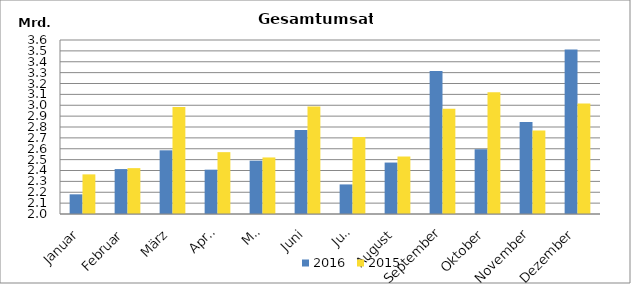
| Category | 2016 | 2015 |
|---|---|---|
| Januar | 2181005.496 | 2364422.329 |
| Februar | 2413069.528 | 2421814.356 |
| März | 2585646.815 | 2983089.045 |
| April | 2407559.039 | 2568682.095 |
| Mai | 2490384.55 | 2520047.22 |
| Juni | 2773486.725 | 2988183.922 |
| Juli | 2271984.23 | 2708478.189 |
| August | 2473032.683 | 2528625.966 |
| September | 3316025.467 | 2968929.838 |
| Oktober | 2595229.851 | 3119123.874 |
| November | 2846318.187 | 2767427.056 |
| Dezember | 3512474.133 | 3015500.346 |